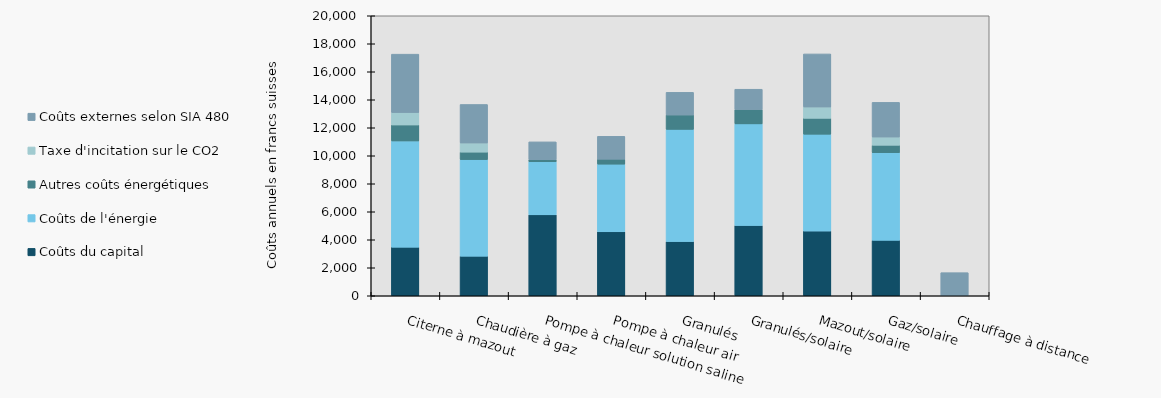
| Category | Coûts du capital | Coûts de l'énergie | Autres coûts énergétiques | Taxe d'incitation sur le CO2 | Coûts externes selon SIA 480 |
|---|---|---|---|---|---|
| Citerne à mazout | 3472.538 | 7585.168 | 1144.101 | 888.323 | 4168.183 |
| Chaudière à gaz | 2829.36 | 6900.296 | 532 | 652.212 | 2751.001 |
| Pompe à chaleur solution saline | 5779.941 | 3790.265 | 150 | 0 | 1273.612 |
| Pompe à chaleur air | 4568.157 | 4834.627 | 350 | 0 | 1637.501 |
| Granulés | 3870.538 | 8016.077 | 1026.762 | 0 | 1618.236 |
| Granulés/solaire | 5022.176 | 7256.469 | 1019.086 | 0 | 1456.412 |
| Mazout/solaire | 4622.334 | 6917.311 | 1137.371 | 807.649 | 3789.644 |
| Gaz/solaire | 3958.816 | 6261.267 | 532 | 586.991 | 2475.901 |
| Chauffage à distance | 0 | 0 | 0 | 0 | 1650.601 |